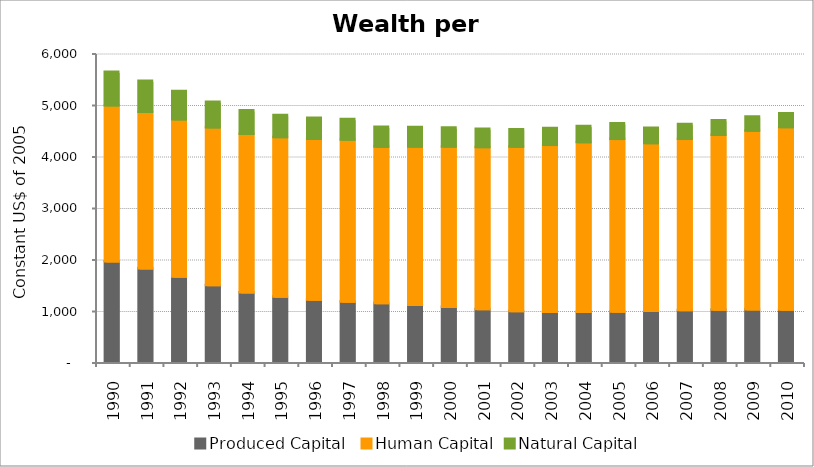
| Category | Produced Capital  | Human Capital | Natural Capital |
|---|---|---|---|
| 1990.0 | 1952.957 | 3029.411 | 650.117 |
| 1991.0 | 1813.913 | 3042.257 | 601.248 |
| 1992.0 | 1655.525 | 3054.686 | 545.999 |
| 1993.0 | 1491.304 | 3064.4 | 494.683 |
| 1994.0 | 1351.377 | 3076.623 | 454.034 |
| 1995.0 | 1266.565 | 3098.618 | 425.257 |
| 1996.0 | 1209.168 | 3121.882 | 406.398 |
| 1997.0 | 1169.877 | 3147.67 | 394.228 |
| 1998.0 | 1139.753 | 3038.635 | 385.579 |
| 1999.0 | 1108.318 | 3073.609 | 376.899 |
| 2000.0 | 1069.458 | 3111.469 | 366.105 |
| 2001.0 | 1024.418 | 3146.892 | 353.314 |
| 2002.0 | 985.799 | 3191.71 | 339.425 |
| 2003.0 | 970.424 | 3242.026 | 325.644 |
| 2004.0 | 969.943 | 3295.188 | 313.216 |
| 2005.0 | 977.534 | 3350.689 | 302.721 |
| 2006.0 | 988.026 | 3259.556 | 294.089 |
| 2007.0 | 1003.326 | 3326.035 | 286.706 |
| 2008.0 | 1013.123 | 3395.835 | 279.956 |
| 2009.0 | 1019.598 | 3468.541 | 273.147 |
| 2010.0 | 1016.4 | 3541.676 | 265.713 |